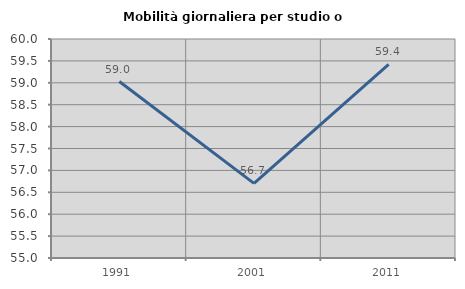
| Category | Mobilità giornaliera per studio o lavoro |
|---|---|
| 1991.0 | 59.028 |
| 2001.0 | 56.704 |
| 2011.0 | 59.419 |